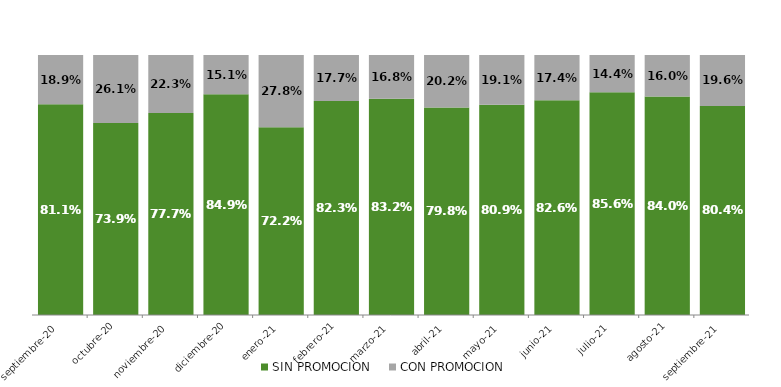
| Category | SIN PROMOCION   | CON PROMOCION   |
|---|---|---|
| 2020-09-01 | 0.811 | 0.189 |
| 2020-10-01 | 0.739 | 0.261 |
| 2020-11-01 | 0.777 | 0.223 |
| 2020-12-01 | 0.849 | 0.151 |
| 2021-01-01 | 0.722 | 0.278 |
| 2021-02-01 | 0.823 | 0.177 |
| 2021-03-01 | 0.832 | 0.168 |
| 2021-04-01 | 0.798 | 0.202 |
| 2021-05-01 | 0.809 | 0.191 |
| 2021-06-01 | 0.826 | 0.174 |
| 2021-07-01 | 0.856 | 0.144 |
| 2021-08-01 | 0.84 | 0.16 |
| 2021-09-01 | 0.804 | 0.196 |